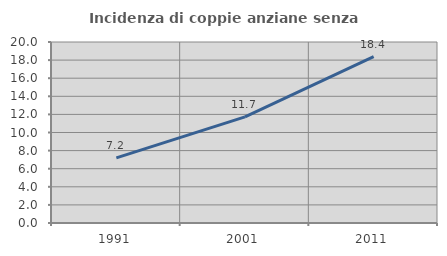
| Category | Incidenza di coppie anziane senza figli  |
|---|---|
| 1991.0 | 7.193 |
| 2001.0 | 11.733 |
| 2011.0 | 18.382 |